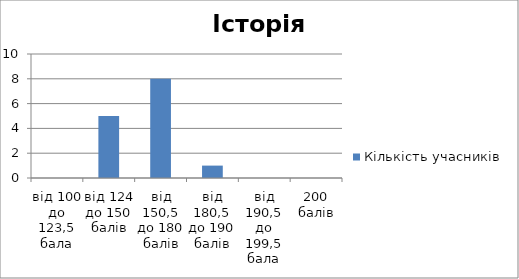
| Category | Кількість учасників |
|---|---|
| від 100 до 123,5 бала | 0 |
| від 124 до 150 балів | 5 |
| від 150,5 до 180 балів | 8 |
| від 180,5 до 190 балів | 1 |
| від 190,5 до 199,5 бала | 0 |
| 200 балів | 0 |